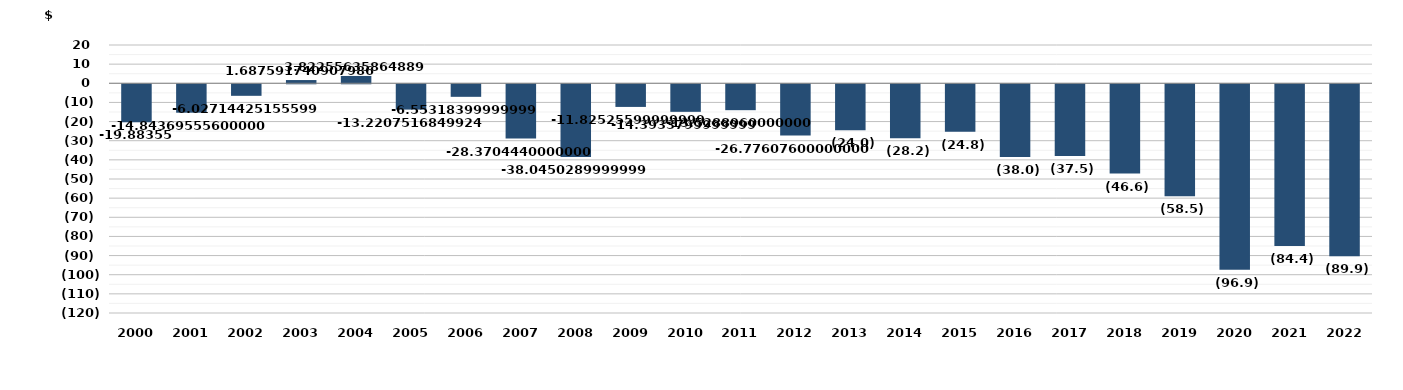
| Category | Series 0 |
|---|---|
| 2000.0 | -19.884 |
| 2001.0 | -14.844 |
| 2002.0 | -6.027 |
| 2003.0 | 1.688 |
| 2004.0 | 3.823 |
| 2005.0 | -13.221 |
| 2006.0 | -6.553 |
| 2007.0 | -28.37 |
| 2008.0 | -38.045 |
| 2009.0 | -11.825 |
| 2010.0 | -14.393 |
| 2011.0 | -13.529 |
| 2012.0 | -26.776 |
| 2013.0 | -24 |
| 2014.0 | -28.222 |
| 2015.0 | -24.825 |
| 2016.0 | -38.045 |
| 2017.0 | -37.5 |
| 2018.0 | -46.623 |
| 2019.0 | -58.522 |
| 2020.0 | -96.944 |
| 2021.0 | -84.432 |
| 2022.0 | -89.897 |